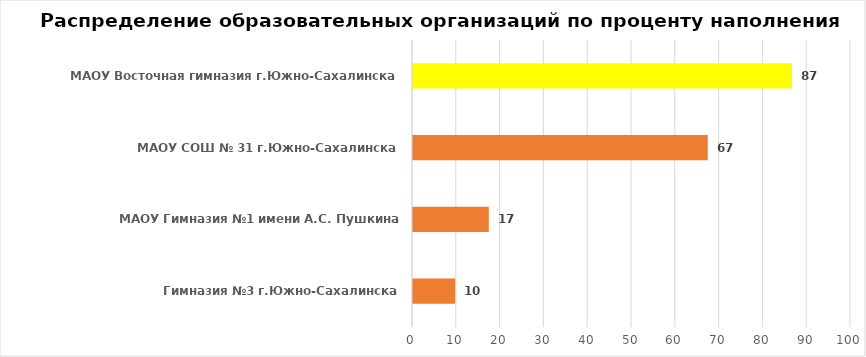
| Category | Series 0 |
|---|---|
| Гимназия №3 г.Южно-Сахалинска | 9.615 |
| МАОУ Гимназия №1 имени А.С. Пушкина г.Южно-Сахалинска | 17.308 |
| МАОУ СОШ № 31 г.Южно-Сахалинска | 67.308 |
| МАОУ Восточная гимназия г.Южно-Сахалинска | 86.538 |